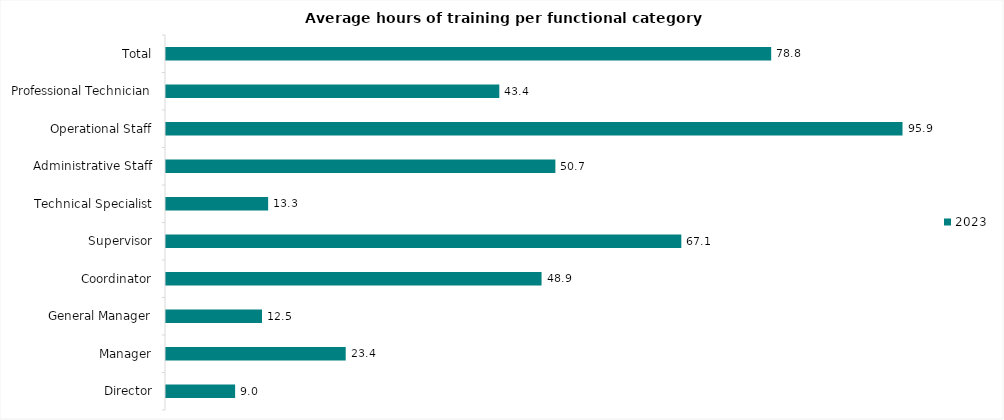
| Category | 2023 |
|---|---|
| Director | 9 |
| Manager | 23.4 |
| General Manager | 12.5 |
| Coordinator | 48.9 |
| Supervisor | 67.1 |
| Technical Specialist | 13.3 |
| Administrative Staff | 50.7 |
| Operational Staff | 95.9 |
| Professional Technician | 43.4 |
| Total | 78.8 |